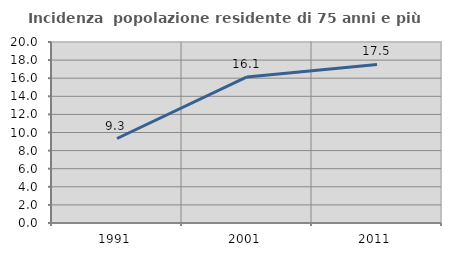
| Category | Incidenza  popolazione residente di 75 anni e più |
|---|---|
| 1991.0 | 9.336 |
| 2001.0 | 16.139 |
| 2011.0 | 17.514 |